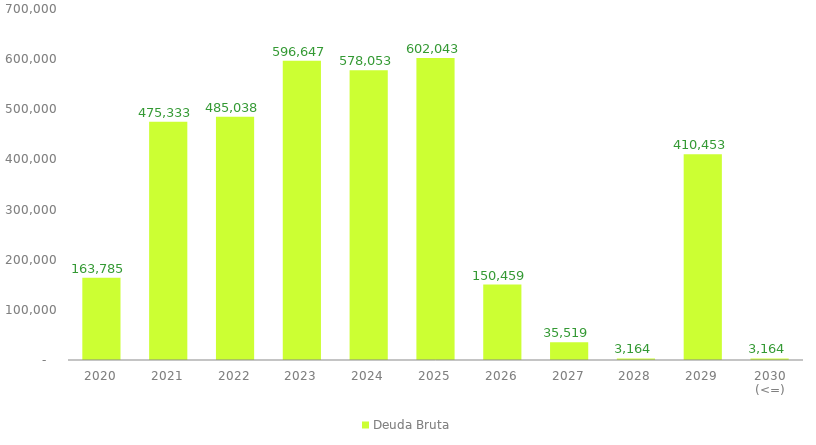
| Category | Deuda Bruta |
|---|---|
| 2020 | 163785.163 |
| 2021 | 475332.879 |
| 2022 | 485038.024 |
| 2023 | 596646.596 |
| 2024 | 578053.454 |
| 2025 | 602043.086 |
| 2026 | 150459.346 |
| 2027 | 35519.065 |
| 2028 | 3164.108 |
| 2029 | 410452.808 |
| 2030 (<=) | 3164.108 |